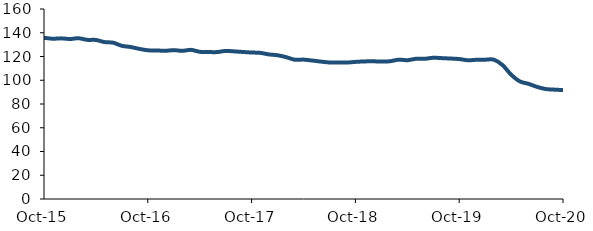
| Category | Series 0 |
|---|---|
| 2015-10-01 | 135.789 |
| 2015-11-01 | 134.951 |
| 2015-12-01 | 135.276 |
| 2016-01-01 | 134.733 |
| 2016-02-01 | 135.356 |
| 2016-03-01 | 134.015 |
| 2016-04-01 | 133.922 |
| 2016-05-01 | 132.141 |
| 2016-06-01 | 131.623 |
| 2016-07-01 | 128.99 |
| 2016-08-01 | 128.015 |
| 2016-09-01 | 126.449 |
| 2016-10-01 | 125.24 |
| 2016-11-01 | 125.098 |
| 2016-12-01 | 124.805 |
| 2017-01-01 | 125.34 |
| 2017-02-01 | 124.77 |
| 2017-03-01 | 125.585 |
| 2017-04-01 | 123.952 |
| 2017-05-01 | 123.751 |
| 2017-06-01 | 123.726 |
| 2017-07-01 | 124.701 |
| 2017-08-01 | 124.311 |
| 2017-09-01 | 123.815 |
| 2017-10-01 | 123.341 |
| 2017-11-01 | 123.064 |
| 2017-12-01 | 121.768 |
| 2018-01-01 | 121.036 |
| 2018-02-01 | 119.444 |
| 2018-03-01 | 117.258 |
| 2018-04-01 | 117.381 |
| 2018-05-01 | 116.619 |
| 2018-06-01 | 115.72 |
| 2018-07-01 | 114.964 |
| 2018-08-01 | 114.93 |
| 2018-09-01 | 114.902 |
| 2018-10-01 | 115.453 |
| 2018-11-01 | 115.838 |
| 2018-12-01 | 115.968 |
| 2019-01-01 | 115.731 |
| 2019-02-01 | 115.981 |
| 2019-03-01 | 117.335 |
| 2019-04-01 | 116.879 |
| 2019-05-01 | 118.056 |
| 2019-06-01 | 118.059 |
| 2019-07-01 | 118.921 |
| 2019-08-01 | 118.635 |
| 2019-09-01 | 118.287 |
| 2019-10-01 | 117.85 |
| 2019-11-01 | 116.835 |
| 2019-12-01 | 117.224 |
| 2020-01-01 | 117.309 |
| 2020-02-01 | 117.318 |
| 2020-03-01 | 112.843 |
| 2020-04-01 | 104.749 |
| 2020-05-01 | 99.065 |
| 2020-06-01 | 97 |
| 2020-07-01 | 94.403 |
| 2020-08-01 | 92.588 |
| 2020-09-01 | 92.095 |
| 2020-10-01 | 91.72 |